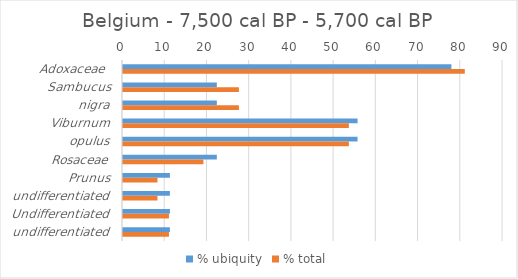
| Category | % ubiquity | % total |
|---|---|---|
| Adoxaceae  | 77.778 | 80.949 |
| Sambucus | 22.222 | 27.452 |
| nigra | 22.222 | 27.452 |
| Viburnum | 55.556 | 53.498 |
| opulus | 55.556 | 53.498 |
| Rosaceae | 22.222 | 19.051 |
| Prunus | 11.111 | 8.167 |
| undifferentiated | 11.111 | 8.167 |
| Undifferentiated | 11.111 | 10.884 |
| undifferentiated | 11.111 | 10.884 |